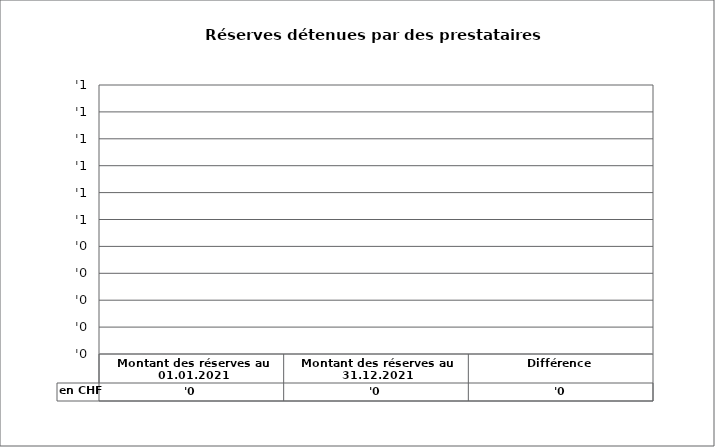
| Category | en CHF |
|---|---|
| Montant des réserves au 01.01.2021 | 0 |
| Montant des réserves au 31.12.2021 | 0 |
| Différence | 0 |